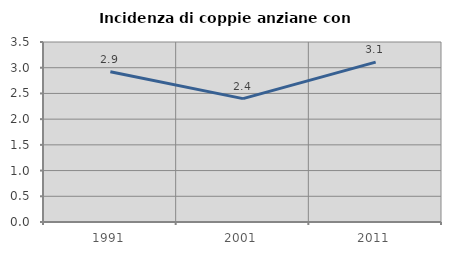
| Category | Incidenza di coppie anziane con figli |
|---|---|
| 1991.0 | 2.921 |
| 2001.0 | 2.399 |
| 2011.0 | 3.108 |